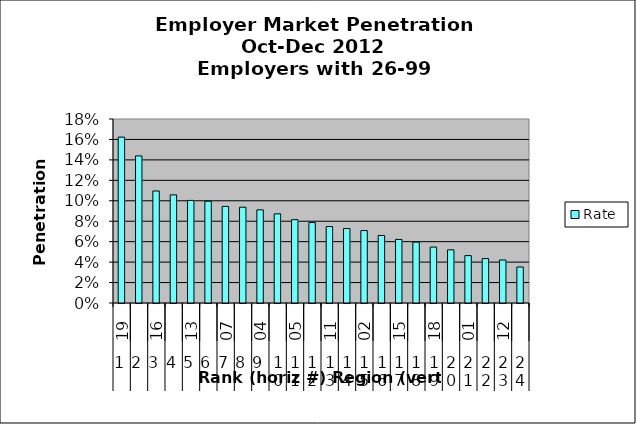
| Category | Rate |
|---|---|
| 0 | 0.162 |
| 1 | 0.144 |
| 2 | 0.11 |
| 3 | 0.106 |
| 4 | 0.1 |
| 5 | 0.1 |
| 6 | 0.094 |
| 7 | 0.094 |
| 8 | 0.091 |
| 9 | 0.087 |
| 10 | 0.082 |
| 11 | 0.079 |
| 12 | 0.075 |
| 13 | 0.073 |
| 14 | 0.071 |
| 15 | 0.066 |
| 16 | 0.062 |
| 17 | 0.06 |
| 18 | 0.055 |
| 19 | 0.052 |
| 20 | 0.046 |
| 21 | 0.043 |
| 22 | 0.042 |
| 23 | 0.035 |